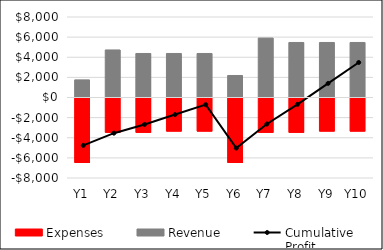
| Category | Expenses | Revenue |
|---|---|---|
| Y1 | -6510 | 1750 |
| Y2 | -3510 | 4725 |
| Y3 | -3510 | 4375 |
| Y4 | -3390 | 4375 |
| Y5 | -3390 | 4375 |
| Y6 | -6510 | 2187.5 |
| Y7 | -3510 | 5906.25 |
| Y8 | -3510 | 5468.75 |
| Y9 | -3390 | 5468.75 |
| Y10 | -3390 | 5468.75 |